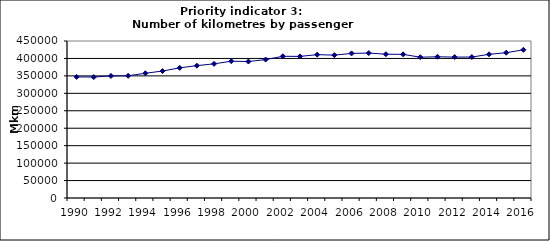
| Category | Number of kilometres by passenger cars, Mkm |
|---|---|
| 1990 | 347121.52 |
| 1991 | 346663.773 |
| 1992 | 349874.831 |
| 1993 | 350271.132 |
| 1994 | 357496.814 |
| 1995 | 363891.087 |
| 1996 | 373090.262 |
| 1997 | 379361.786 |
| 1998 | 384558.439 |
| 1999 | 392061.376 |
| 2000 | 391196.253 |
| 2001 | 396782.462 |
| 2002 | 406184.649 |
| 2003 | 405846.693 |
| 2004 | 410881.608 |
| 2005 | 409491.17 |
| 2006 | 414364.047 |
| 2007 | 415549.977 |
| 2008 | 412136.52 |
| 2009 | 411731.416 |
| 2010 | 403515.283 |
| 2011 | 404765.257 |
| 2012 | 403948.387 |
| 2013 | 403925.172 |
| 2014 | 411866.353 |
| 2015 | 416447.983 |
| 2016 | 424703.365 |